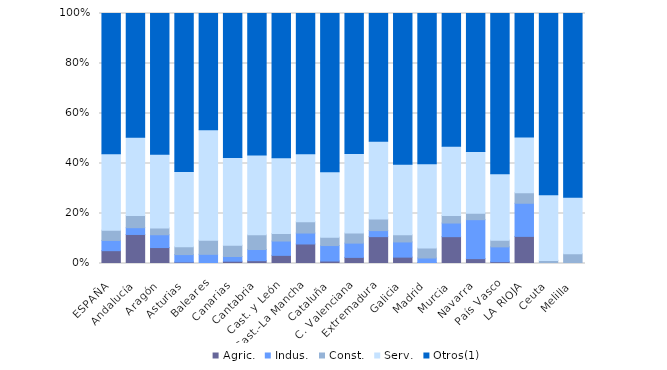
| Category | Agric. | Indus. | Const. | Serv. | Otros(1) |
|---|---|---|---|---|---|
| ESPAÑA | 5.132 | 4.104 | 4.059 | 30.627 | 56.079 |
| Andalucía | 11.613 | 2.714 | 4.9 | 31.242 | 49.531 |
| Aragón | 6.378 | 5.125 | 2.733 | 29.499 | 56.264 |
| Asturias | 0.594 | 2.972 | 3.12 | 30.015 | 63.15 |
| Baleares | 0 | 3.663 | 5.617 | 44.2 | 46.398 |
| Canarias | 0.912 | 1.898 | 4.526 | 35.036 | 57.664 |
| Cantabria | 1.12 | 4.482 | 5.882 | 31.933 | 56.583 |
| Cast. y León | 3.253 | 5.736 | 3.016 | 30.337 | 57.658 |
| Cast.-La Mancha | 7.808 | 4.384 | 4.475 | 27.26 | 56.119 |
| Cataluña | 0.985 | 6.195 | 3.33 | 26.213 | 63.277 |
| C. Valenciana | 2.439 | 5.712 | 4.022 | 31.793 | 56.012 |
| Extremadura | 10.757 | 2.406 | 4.6 | 31.139 | 51.168 |
| Galicia | 2.547 | 6.072 | 2.84 | 28.257 | 60.235 |
| Madrid | 0.307 | 1.901 | 3.946 | 33.756 | 60.09 |
| Murcia | 10.728 | 5.441 | 3.065 | 27.586 | 53.103 |
| Navarra | 1.948 | 15.584 | 2.597 | 24.675 | 55.195 |
| País Vasco | 0.713 | 5.943 | 2.694 | 26.624 | 64.105 |
| LA RIOJA | 10.843 | 13.253 | 4.217 | 22.289 | 49.398 |
| Ceuta | 0 | 0 | 1.25 | 26.25 | 72.5 |
| Melilla | 0 | 0 | 3.922 | 22.549 | 73.529 |